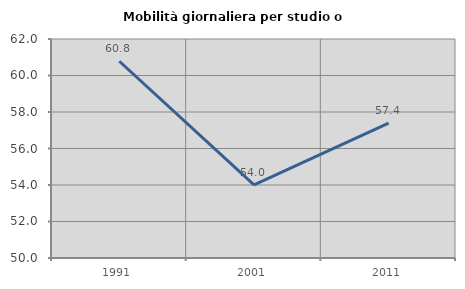
| Category | Mobilità giornaliera per studio o lavoro |
|---|---|
| 1991.0 | 60.78 |
| 2001.0 | 54.006 |
| 2011.0 | 57.392 |